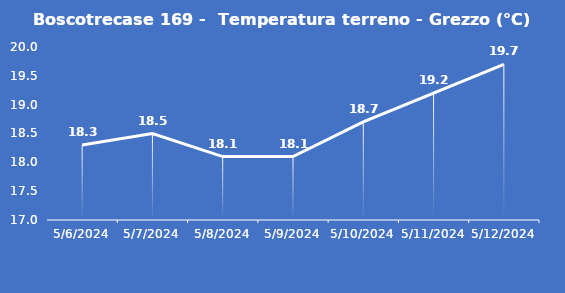
| Category | Boscotrecase 169 -  Temperatura terreno - Grezzo (°C) |
|---|---|
| 5/6/24 | 18.3 |
| 5/7/24 | 18.5 |
| 5/8/24 | 18.1 |
| 5/9/24 | 18.1 |
| 5/10/24 | 18.7 |
| 5/11/24 | 19.2 |
| 5/12/24 | 19.7 |